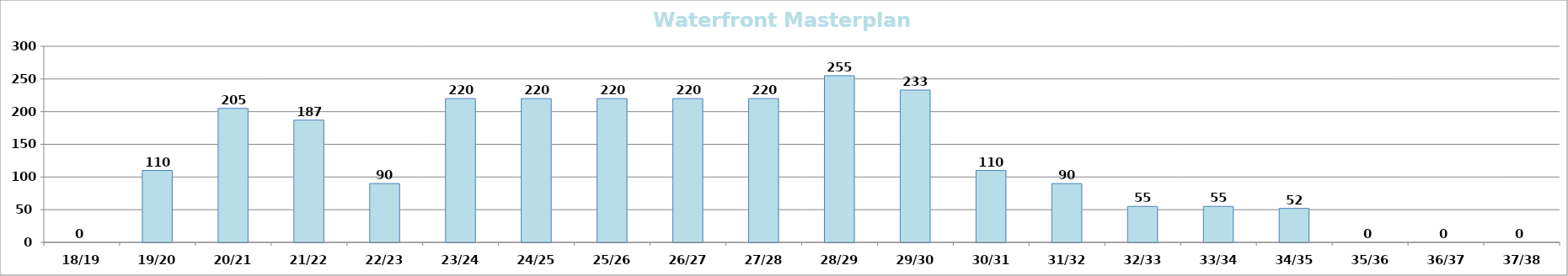
| Category | Waterfront Masterplan Total |
|---|---|
| 18/19 | 0 |
| 19/20 | 110 |
| 20/21 | 205 |
| 21/22 | 187 |
| 22/23 | 90 |
| 23/24 | 220 |
| 24/25 | 220 |
| 25/26 | 220 |
| 26/27 | 220 |
| 27/28 | 220 |
| 28/29 | 255 |
| 29/30 | 233 |
| 30/31 | 110 |
| 31/32 | 90 |
| 32/33 | 55 |
| 33/34 | 55 |
| 34/35 | 52 |
| 35/36 | 0 |
| 36/37 | 0 |
| 37/38 | 0 |